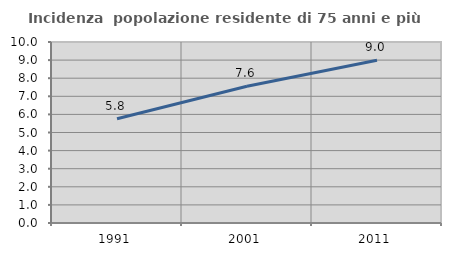
| Category | Incidenza  popolazione residente di 75 anni e più |
|---|---|
| 1991.0 | 5.761 |
| 2001.0 | 7.553 |
| 2011.0 | 8.996 |